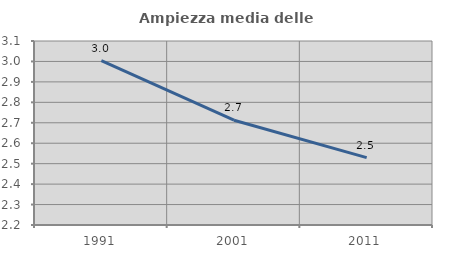
| Category | Ampiezza media delle famiglie |
|---|---|
| 1991.0 | 3.004 |
| 2001.0 | 2.713 |
| 2011.0 | 2.53 |